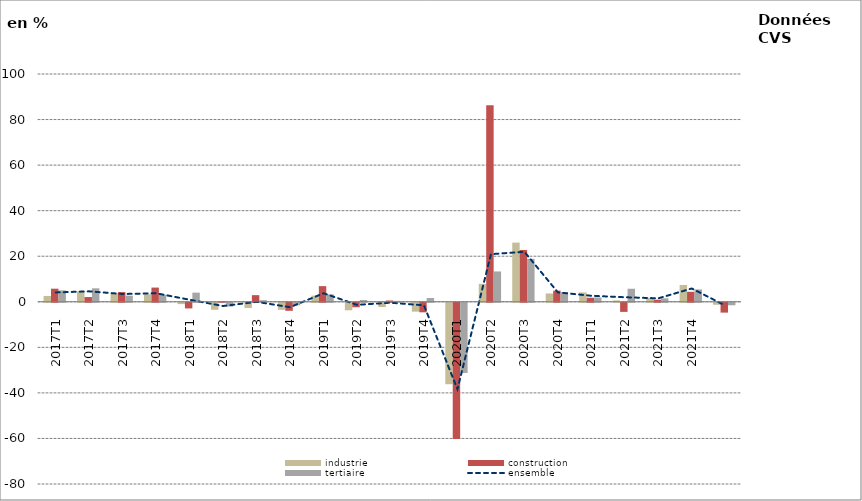
| Category | industrie | construction | tertiaire |
|---|---|---|---|
| 2017T1 | 2.558 | 5.738 | 5.015 |
| 2017T2 | 4.547 | 2.082 | 5.906 |
| 2017T3 | 3.765 | 4.269 | 2.686 |
| 2017T4 | 3.275 | 6.238 | 3.026 |
| 2018T1 | -0.586 | -2.478 | 4.02 |
| 2018T2 | -3.061 | 0.197 | -1.677 |
| 2018T3 | -2.278 | 2.911 | 0.71 |
| 2018T4 | -3.1 | -3.524 | -1.128 |
| 2019T1 | 2.707 | 6.873 | 3.254 |
| 2019T2 | -3.295 | -1.964 | 0.765 |
| 2019T3 | -1.856 | 0.565 | 0.389 |
| 2019T4 | -3.894 | -4.185 | 1.649 |
| 2020T1 | -35.76 | -59.781 | -30.806 |
| 2020T2 | 7.872 | 86.293 | 13.319 |
| 2020T3 | 25.98 | 22.75 | 18.841 |
| 2020T4 | 3.64 | 4.89 | 4.223 |
| 2021T1 | 4.097 | 1.772 | 1.888 |
| 2021T2 | 0.605 | -3.996 | 5.716 |
| 2021T3 | 1.765 | 0.913 | 1.509 |
| 2021T4 | 7.383 | 4.379 | 5.412 |